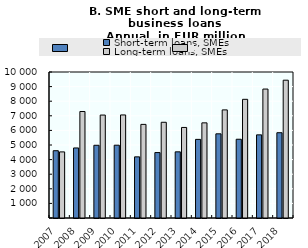
| Category | Short-term loans, SMEs | Long-term loans, SMEs |
|---|---|---|
| 2007.0 | 4609 | 4527 |
| 2008.0 | 4797 | 7295 |
| 2009.0 | 4981 | 7051 |
| 2010.0 | 4987 | 7059 |
| 2011.0 | 4188 | 6412 |
| 2012.0 | 4481 | 6557 |
| 2013.0 | 4532 | 6202 |
| 2014.0 | 5385 | 6517 |
| 2015.0 | 5766 | 7404 |
| 2016.0 | 5394 | 8129 |
| 2017.0 | 5695 | 8832 |
| 2018.0 | 5842 | 9439 |